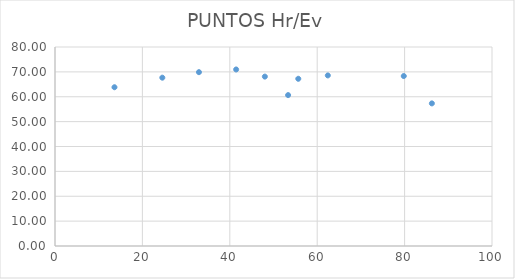
| Category | Series 0 |
|---|---|
| 55.67 | 67.226 |
| 32.94 | 69.884 |
| 53.34000000000001 | 60.661 |
| 79.81 | 68.322 |
| 62.42999999999999 | 68.571 |
| 24.56 | 67.669 |
| 41.45 | 70.965 |
| 48.02 | 68.102 |
| 13.610000000000001 | 63.823 |
| 86.24 | 57.332 |